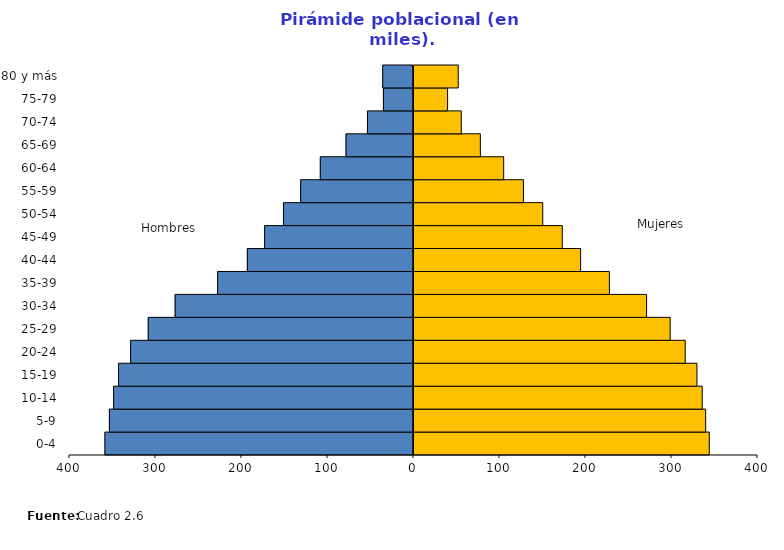
| Category | Hombres | Mujeres |
|---|---|---|
| 0-4 | -358.794 | 344.519 |
| 5-9 | -353.616 | 340.294 |
| 10-14 | -348.715 | 336.31 |
| 15-19 | -342.989 | 330.186 |
| 20-24 | -328.931 | 316.539 |
| 25-29 | -308.437 | 299.043 |
| 30-34 | -277.165 | 271.62 |
| 35-39 | -227.786 | 228.374 |
| 40-44 | -193.214 | 194.924 |
| 45-49 | -173.079 | 173.563 |
| 50-54 | -151.206 | 150.883 |
| 55-59 | -131.203 | 128.427 |
| 60-64 | -108.361 | 105.447 |
| 65-69 | -78.475 | 78.327 |
| 70-74 | -53.527 | 56.136 |
| 75-79 | -34.973 | 40.242 |
| 80 y más | -35.771 | 52.57 |